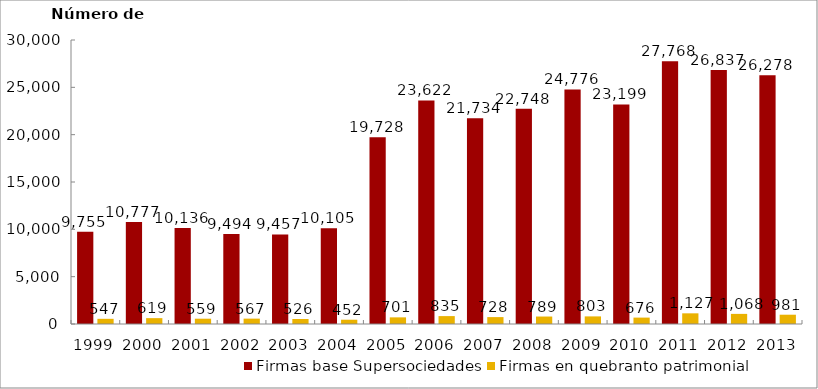
| Category | Firmas base Supersociedades | Firmas en quebranto patrimonial |
|---|---|---|
| 1999.0 | 9755 | 547 |
| 2000.0 | 10777 | 619 |
| 2001.0 | 10136 | 559 |
| 2002.0 | 9494 | 567 |
| 2003.0 | 9457 | 526 |
| 2004.0 | 10105 | 452 |
| 2005.0 | 19728 | 701 |
| 2006.0 | 23622 | 835 |
| 2007.0 | 21734 | 728 |
| 2008.0 | 22748 | 789 |
| 2009.0 | 24776 | 803 |
| 2010.0 | 23199 | 676 |
| 2011.0 | 27768 | 1127 |
| 2012.0 | 26837 | 1068 |
| 2013.0 | 26278 | 981 |